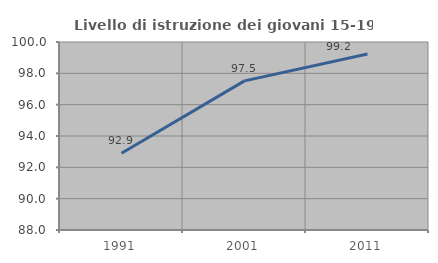
| Category | Livello di istruzione dei giovani 15-19 anni |
|---|---|
| 1991.0 | 92.899 |
| 2001.0 | 97.521 |
| 2011.0 | 99.237 |